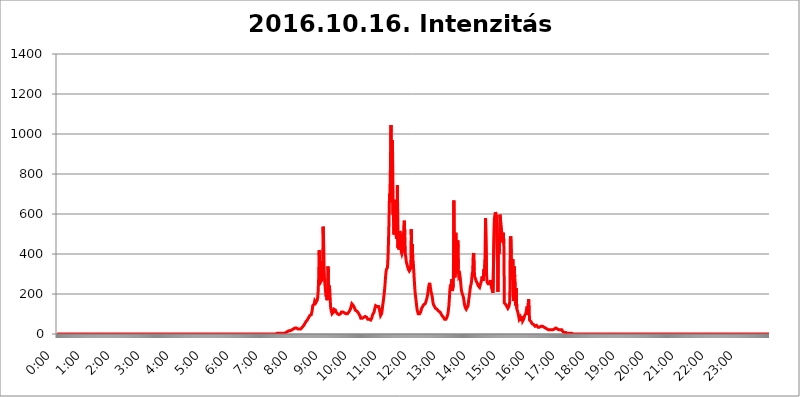
| Category | 2016.10.16. Intenzitás [W/m^2] |
|---|---|
| 0.0 | 0 |
| 0.0006944444444444445 | 0 |
| 0.001388888888888889 | 0 |
| 0.0020833333333333333 | 0 |
| 0.002777777777777778 | 0 |
| 0.003472222222222222 | 0 |
| 0.004166666666666667 | 0 |
| 0.004861111111111111 | 0 |
| 0.005555555555555556 | 0 |
| 0.0062499999999999995 | 0 |
| 0.006944444444444444 | 0 |
| 0.007638888888888889 | 0 |
| 0.008333333333333333 | 0 |
| 0.009027777777777779 | 0 |
| 0.009722222222222222 | 0 |
| 0.010416666666666666 | 0 |
| 0.011111111111111112 | 0 |
| 0.011805555555555555 | 0 |
| 0.012499999999999999 | 0 |
| 0.013194444444444444 | 0 |
| 0.013888888888888888 | 0 |
| 0.014583333333333332 | 0 |
| 0.015277777777777777 | 0 |
| 0.015972222222222224 | 0 |
| 0.016666666666666666 | 0 |
| 0.017361111111111112 | 0 |
| 0.018055555555555557 | 0 |
| 0.01875 | 0 |
| 0.019444444444444445 | 0 |
| 0.02013888888888889 | 0 |
| 0.020833333333333332 | 0 |
| 0.02152777777777778 | 0 |
| 0.022222222222222223 | 0 |
| 0.02291666666666667 | 0 |
| 0.02361111111111111 | 0 |
| 0.024305555555555556 | 0 |
| 0.024999999999999998 | 0 |
| 0.025694444444444447 | 0 |
| 0.02638888888888889 | 0 |
| 0.027083333333333334 | 0 |
| 0.027777777777777776 | 0 |
| 0.02847222222222222 | 0 |
| 0.029166666666666664 | 0 |
| 0.029861111111111113 | 0 |
| 0.030555555555555555 | 0 |
| 0.03125 | 0 |
| 0.03194444444444445 | 0 |
| 0.03263888888888889 | 0 |
| 0.03333333333333333 | 0 |
| 0.034027777777777775 | 0 |
| 0.034722222222222224 | 0 |
| 0.035416666666666666 | 0 |
| 0.036111111111111115 | 0 |
| 0.03680555555555556 | 0 |
| 0.0375 | 0 |
| 0.03819444444444444 | 0 |
| 0.03888888888888889 | 0 |
| 0.03958333333333333 | 0 |
| 0.04027777777777778 | 0 |
| 0.04097222222222222 | 0 |
| 0.041666666666666664 | 0 |
| 0.042361111111111106 | 0 |
| 0.04305555555555556 | 0 |
| 0.043750000000000004 | 0 |
| 0.044444444444444446 | 0 |
| 0.04513888888888889 | 0 |
| 0.04583333333333334 | 0 |
| 0.04652777777777778 | 0 |
| 0.04722222222222222 | 0 |
| 0.04791666666666666 | 0 |
| 0.04861111111111111 | 0 |
| 0.049305555555555554 | 0 |
| 0.049999999999999996 | 0 |
| 0.05069444444444445 | 0 |
| 0.051388888888888894 | 0 |
| 0.052083333333333336 | 0 |
| 0.05277777777777778 | 0 |
| 0.05347222222222222 | 0 |
| 0.05416666666666667 | 0 |
| 0.05486111111111111 | 0 |
| 0.05555555555555555 | 0 |
| 0.05625 | 0 |
| 0.05694444444444444 | 0 |
| 0.057638888888888885 | 0 |
| 0.05833333333333333 | 0 |
| 0.05902777777777778 | 0 |
| 0.059722222222222225 | 0 |
| 0.06041666666666667 | 0 |
| 0.061111111111111116 | 0 |
| 0.06180555555555556 | 0 |
| 0.0625 | 0 |
| 0.06319444444444444 | 0 |
| 0.06388888888888888 | 0 |
| 0.06458333333333334 | 0 |
| 0.06527777777777778 | 0 |
| 0.06597222222222222 | 0 |
| 0.06666666666666667 | 0 |
| 0.06736111111111111 | 0 |
| 0.06805555555555555 | 0 |
| 0.06874999999999999 | 0 |
| 0.06944444444444443 | 0 |
| 0.07013888888888889 | 0 |
| 0.07083333333333333 | 0 |
| 0.07152777777777779 | 0 |
| 0.07222222222222223 | 0 |
| 0.07291666666666667 | 0 |
| 0.07361111111111111 | 0 |
| 0.07430555555555556 | 0 |
| 0.075 | 0 |
| 0.07569444444444444 | 0 |
| 0.0763888888888889 | 0 |
| 0.07708333333333334 | 0 |
| 0.07777777777777778 | 0 |
| 0.07847222222222222 | 0 |
| 0.07916666666666666 | 0 |
| 0.0798611111111111 | 0 |
| 0.08055555555555556 | 0 |
| 0.08125 | 0 |
| 0.08194444444444444 | 0 |
| 0.08263888888888889 | 0 |
| 0.08333333333333333 | 0 |
| 0.08402777777777777 | 0 |
| 0.08472222222222221 | 0 |
| 0.08541666666666665 | 0 |
| 0.08611111111111112 | 0 |
| 0.08680555555555557 | 0 |
| 0.08750000000000001 | 0 |
| 0.08819444444444445 | 0 |
| 0.08888888888888889 | 0 |
| 0.08958333333333333 | 0 |
| 0.09027777777777778 | 0 |
| 0.09097222222222222 | 0 |
| 0.09166666666666667 | 0 |
| 0.09236111111111112 | 0 |
| 0.09305555555555556 | 0 |
| 0.09375 | 0 |
| 0.09444444444444444 | 0 |
| 0.09513888888888888 | 0 |
| 0.09583333333333333 | 0 |
| 0.09652777777777777 | 0 |
| 0.09722222222222222 | 0 |
| 0.09791666666666667 | 0 |
| 0.09861111111111111 | 0 |
| 0.09930555555555555 | 0 |
| 0.09999999999999999 | 0 |
| 0.10069444444444443 | 0 |
| 0.1013888888888889 | 0 |
| 0.10208333333333335 | 0 |
| 0.10277777777777779 | 0 |
| 0.10347222222222223 | 0 |
| 0.10416666666666667 | 0 |
| 0.10486111111111111 | 0 |
| 0.10555555555555556 | 0 |
| 0.10625 | 0 |
| 0.10694444444444444 | 0 |
| 0.1076388888888889 | 0 |
| 0.10833333333333334 | 0 |
| 0.10902777777777778 | 0 |
| 0.10972222222222222 | 0 |
| 0.1111111111111111 | 0 |
| 0.11180555555555556 | 0 |
| 0.11180555555555556 | 0 |
| 0.1125 | 0 |
| 0.11319444444444444 | 0 |
| 0.11388888888888889 | 0 |
| 0.11458333333333333 | 0 |
| 0.11527777777777777 | 0 |
| 0.11597222222222221 | 0 |
| 0.11666666666666665 | 0 |
| 0.1173611111111111 | 0 |
| 0.11805555555555557 | 0 |
| 0.11944444444444445 | 0 |
| 0.12013888888888889 | 0 |
| 0.12083333333333333 | 0 |
| 0.12152777777777778 | 0 |
| 0.12222222222222223 | 0 |
| 0.12291666666666667 | 0 |
| 0.12291666666666667 | 0 |
| 0.12361111111111112 | 0 |
| 0.12430555555555556 | 0 |
| 0.125 | 0 |
| 0.12569444444444444 | 0 |
| 0.12638888888888888 | 0 |
| 0.12708333333333333 | 0 |
| 0.16875 | 0 |
| 0.12847222222222224 | 0 |
| 0.12916666666666668 | 0 |
| 0.12986111111111112 | 0 |
| 0.13055555555555556 | 0 |
| 0.13125 | 0 |
| 0.13194444444444445 | 0 |
| 0.1326388888888889 | 0 |
| 0.13333333333333333 | 0 |
| 0.13402777777777777 | 0 |
| 0.13402777777777777 | 0 |
| 0.13472222222222222 | 0 |
| 0.13541666666666666 | 0 |
| 0.1361111111111111 | 0 |
| 0.13749999999999998 | 0 |
| 0.13819444444444443 | 0 |
| 0.1388888888888889 | 0 |
| 0.13958333333333334 | 0 |
| 0.14027777777777778 | 0 |
| 0.14097222222222222 | 0 |
| 0.14166666666666666 | 0 |
| 0.1423611111111111 | 0 |
| 0.14305555555555557 | 0 |
| 0.14375000000000002 | 0 |
| 0.14444444444444446 | 0 |
| 0.1451388888888889 | 0 |
| 0.1451388888888889 | 0 |
| 0.14652777777777778 | 0 |
| 0.14722222222222223 | 0 |
| 0.14791666666666667 | 0 |
| 0.1486111111111111 | 0 |
| 0.14930555555555555 | 0 |
| 0.15 | 0 |
| 0.15069444444444444 | 0 |
| 0.15138888888888888 | 0 |
| 0.15208333333333332 | 0 |
| 0.15277777777777776 | 0 |
| 0.15347222222222223 | 0 |
| 0.15416666666666667 | 0 |
| 0.15486111111111112 | 0 |
| 0.15555555555555556 | 0 |
| 0.15625 | 0 |
| 0.15694444444444444 | 0 |
| 0.15763888888888888 | 0 |
| 0.15833333333333333 | 0 |
| 0.15902777777777777 | 0 |
| 0.15972222222222224 | 0 |
| 0.16041666666666668 | 0 |
| 0.16111111111111112 | 0 |
| 0.16180555555555556 | 0 |
| 0.1625 | 0 |
| 0.16319444444444445 | 0 |
| 0.1638888888888889 | 0 |
| 0.16458333333333333 | 0 |
| 0.16527777777777777 | 0 |
| 0.16597222222222222 | 0 |
| 0.16666666666666666 | 0 |
| 0.1673611111111111 | 0 |
| 0.16805555555555554 | 0 |
| 0.16874999999999998 | 0 |
| 0.16944444444444443 | 0 |
| 0.17013888888888887 | 0 |
| 0.1708333333333333 | 0 |
| 0.17152777777777775 | 0 |
| 0.17222222222222225 | 0 |
| 0.1729166666666667 | 0 |
| 0.17361111111111113 | 0 |
| 0.17430555555555557 | 0 |
| 0.17500000000000002 | 0 |
| 0.17569444444444446 | 0 |
| 0.1763888888888889 | 0 |
| 0.17708333333333334 | 0 |
| 0.17777777777777778 | 0 |
| 0.17847222222222223 | 0 |
| 0.17916666666666667 | 0 |
| 0.1798611111111111 | 0 |
| 0.18055555555555555 | 0 |
| 0.18125 | 0 |
| 0.18194444444444444 | 0 |
| 0.1826388888888889 | 0 |
| 0.18333333333333335 | 0 |
| 0.1840277777777778 | 0 |
| 0.18472222222222223 | 0 |
| 0.18541666666666667 | 0 |
| 0.18611111111111112 | 0 |
| 0.18680555555555556 | 0 |
| 0.1875 | 0 |
| 0.18819444444444444 | 0 |
| 0.18888888888888888 | 0 |
| 0.18958333333333333 | 0 |
| 0.19027777777777777 | 0 |
| 0.1909722222222222 | 0 |
| 0.19166666666666665 | 0 |
| 0.19236111111111112 | 0 |
| 0.19305555555555554 | 0 |
| 0.19375 | 0 |
| 0.19444444444444445 | 0 |
| 0.1951388888888889 | 0 |
| 0.19583333333333333 | 0 |
| 0.19652777777777777 | 0 |
| 0.19722222222222222 | 0 |
| 0.19791666666666666 | 0 |
| 0.1986111111111111 | 0 |
| 0.19930555555555554 | 0 |
| 0.19999999999999998 | 0 |
| 0.20069444444444443 | 0 |
| 0.20138888888888887 | 0 |
| 0.2020833333333333 | 0 |
| 0.2027777777777778 | 0 |
| 0.2034722222222222 | 0 |
| 0.2041666666666667 | 0 |
| 0.20486111111111113 | 0 |
| 0.20555555555555557 | 0 |
| 0.20625000000000002 | 0 |
| 0.20694444444444446 | 0 |
| 0.2076388888888889 | 0 |
| 0.20833333333333334 | 0 |
| 0.20902777777777778 | 0 |
| 0.20972222222222223 | 0 |
| 0.21041666666666667 | 0 |
| 0.2111111111111111 | 0 |
| 0.21180555555555555 | 0 |
| 0.2125 | 0 |
| 0.21319444444444444 | 0 |
| 0.2138888888888889 | 0 |
| 0.21458333333333335 | 0 |
| 0.2152777777777778 | 0 |
| 0.21597222222222223 | 0 |
| 0.21666666666666667 | 0 |
| 0.21736111111111112 | 0 |
| 0.21805555555555556 | 0 |
| 0.21875 | 0 |
| 0.21944444444444444 | 0 |
| 0.22013888888888888 | 0 |
| 0.22083333333333333 | 0 |
| 0.22152777777777777 | 0 |
| 0.2222222222222222 | 0 |
| 0.22291666666666665 | 0 |
| 0.2236111111111111 | 0 |
| 0.22430555555555556 | 0 |
| 0.225 | 0 |
| 0.22569444444444445 | 0 |
| 0.2263888888888889 | 0 |
| 0.22708333333333333 | 0 |
| 0.22777777777777777 | 0 |
| 0.22847222222222222 | 0 |
| 0.22916666666666666 | 0 |
| 0.2298611111111111 | 0 |
| 0.23055555555555554 | 0 |
| 0.23124999999999998 | 0 |
| 0.23194444444444443 | 0 |
| 0.23263888888888887 | 0 |
| 0.2333333333333333 | 0 |
| 0.2340277777777778 | 0 |
| 0.2347222222222222 | 0 |
| 0.2354166666666667 | 0 |
| 0.23611111111111113 | 0 |
| 0.23680555555555557 | 0 |
| 0.23750000000000002 | 0 |
| 0.23819444444444446 | 0 |
| 0.2388888888888889 | 0 |
| 0.23958333333333334 | 0 |
| 0.24027777777777778 | 0 |
| 0.24097222222222223 | 0 |
| 0.24166666666666667 | 0 |
| 0.2423611111111111 | 0 |
| 0.24305555555555555 | 0 |
| 0.24375 | 0 |
| 0.24444444444444446 | 0 |
| 0.24513888888888888 | 0 |
| 0.24583333333333335 | 0 |
| 0.2465277777777778 | 0 |
| 0.24722222222222223 | 0 |
| 0.24791666666666667 | 0 |
| 0.24861111111111112 | 0 |
| 0.24930555555555556 | 0 |
| 0.25 | 0 |
| 0.25069444444444444 | 0 |
| 0.2513888888888889 | 0 |
| 0.2520833333333333 | 0 |
| 0.25277777777777777 | 0 |
| 0.2534722222222222 | 0 |
| 0.25416666666666665 | 0 |
| 0.2548611111111111 | 0 |
| 0.2555555555555556 | 0 |
| 0.25625000000000003 | 0 |
| 0.2569444444444445 | 0 |
| 0.2576388888888889 | 0 |
| 0.25833333333333336 | 0 |
| 0.2590277777777778 | 0 |
| 0.25972222222222224 | 0 |
| 0.2604166666666667 | 0 |
| 0.2611111111111111 | 0 |
| 0.26180555555555557 | 0 |
| 0.2625 | 0 |
| 0.26319444444444445 | 0 |
| 0.2638888888888889 | 0 |
| 0.26458333333333334 | 0 |
| 0.2652777777777778 | 0 |
| 0.2659722222222222 | 0 |
| 0.26666666666666666 | 0 |
| 0.2673611111111111 | 0 |
| 0.26805555555555555 | 0 |
| 0.26875 | 0 |
| 0.26944444444444443 | 0 |
| 0.2701388888888889 | 0 |
| 0.2708333333333333 | 0 |
| 0.27152777777777776 | 0 |
| 0.2722222222222222 | 0 |
| 0.27291666666666664 | 0 |
| 0.2736111111111111 | 0 |
| 0.2743055555555555 | 0 |
| 0.27499999999999997 | 0 |
| 0.27569444444444446 | 0 |
| 0.27638888888888885 | 0 |
| 0.27708333333333335 | 0 |
| 0.2777777777777778 | 0 |
| 0.27847222222222223 | 0 |
| 0.2791666666666667 | 0 |
| 0.2798611111111111 | 0 |
| 0.28055555555555556 | 0 |
| 0.28125 | 0 |
| 0.28194444444444444 | 0 |
| 0.2826388888888889 | 0 |
| 0.2833333333333333 | 0 |
| 0.28402777777777777 | 0 |
| 0.2847222222222222 | 0 |
| 0.28541666666666665 | 0 |
| 0.28611111111111115 | 0 |
| 0.28680555555555554 | 0 |
| 0.28750000000000003 | 0 |
| 0.2881944444444445 | 0 |
| 0.2888888888888889 | 0 |
| 0.28958333333333336 | 0 |
| 0.2902777777777778 | 0 |
| 0.29097222222222224 | 0 |
| 0.2916666666666667 | 0 |
| 0.2923611111111111 | 0 |
| 0.29305555555555557 | 0 |
| 0.29375 | 0 |
| 0.29444444444444445 | 0 |
| 0.2951388888888889 | 0 |
| 0.29583333333333334 | 0 |
| 0.2965277777777778 | 0 |
| 0.2972222222222222 | 0 |
| 0.29791666666666666 | 0 |
| 0.2986111111111111 | 0 |
| 0.29930555555555555 | 0 |
| 0.3 | 0 |
| 0.30069444444444443 | 0 |
| 0.3013888888888889 | 0 |
| 0.3020833333333333 | 0 |
| 0.30277777777777776 | 0 |
| 0.3034722222222222 | 0 |
| 0.30416666666666664 | 0 |
| 0.3048611111111111 | 0 |
| 0.3055555555555555 | 0 |
| 0.30624999999999997 | 0 |
| 0.3069444444444444 | 3.525 |
| 0.3076388888888889 | 3.525 |
| 0.30833333333333335 | 3.525 |
| 0.3090277777777778 | 3.525 |
| 0.30972222222222223 | 3.525 |
| 0.3104166666666667 | 3.525 |
| 0.3111111111111111 | 3.525 |
| 0.31180555555555556 | 3.525 |
| 0.3125 | 3.525 |
| 0.31319444444444444 | 3.525 |
| 0.3138888888888889 | 3.525 |
| 0.3145833333333333 | 3.525 |
| 0.31527777777777777 | 3.525 |
| 0.3159722222222222 | 3.525 |
| 0.31666666666666665 | 3.525 |
| 0.31736111111111115 | 3.525 |
| 0.31805555555555554 | 3.525 |
| 0.31875000000000003 | 3.525 |
| 0.3194444444444445 | 3.525 |
| 0.3201388888888889 | 7.887 |
| 0.32083333333333336 | 7.887 |
| 0.3215277777777778 | 7.887 |
| 0.32222222222222224 | 7.887 |
| 0.3229166666666667 | 12.257 |
| 0.3236111111111111 | 12.257 |
| 0.32430555555555557 | 16.636 |
| 0.325 | 16.636 |
| 0.32569444444444445 | 16.636 |
| 0.3263888888888889 | 16.636 |
| 0.32708333333333334 | 16.636 |
| 0.3277777777777778 | 21.024 |
| 0.3284722222222222 | 21.024 |
| 0.32916666666666666 | 21.024 |
| 0.3298611111111111 | 21.024 |
| 0.33055555555555555 | 21.024 |
| 0.33125 | 25.419 |
| 0.33194444444444443 | 25.419 |
| 0.3326388888888889 | 25.419 |
| 0.3333333333333333 | 29.823 |
| 0.3340277777777778 | 29.823 |
| 0.3347222222222222 | 29.823 |
| 0.3354166666666667 | 29.823 |
| 0.3361111111111111 | 29.823 |
| 0.3368055555555556 | 29.823 |
| 0.33749999999999997 | 25.419 |
| 0.33819444444444446 | 25.419 |
| 0.33888888888888885 | 25.419 |
| 0.33958333333333335 | 25.419 |
| 0.34027777777777773 | 25.419 |
| 0.34097222222222223 | 25.419 |
| 0.3416666666666666 | 25.419 |
| 0.3423611111111111 | 25.419 |
| 0.3430555555555555 | 29.823 |
| 0.34375 | 34.234 |
| 0.3444444444444445 | 34.234 |
| 0.3451388888888889 | 38.653 |
| 0.3458333333333334 | 43.079 |
| 0.34652777777777777 | 47.511 |
| 0.34722222222222227 | 51.951 |
| 0.34791666666666665 | 56.398 |
| 0.34861111111111115 | 60.85 |
| 0.34930555555555554 | 65.31 |
| 0.35000000000000003 | 65.31 |
| 0.3506944444444444 | 69.775 |
| 0.3513888888888889 | 74.246 |
| 0.3520833333333333 | 78.722 |
| 0.3527777777777778 | 83.205 |
| 0.3534722222222222 | 83.205 |
| 0.3541666666666667 | 92.184 |
| 0.3548611111111111 | 92.184 |
| 0.35555555555555557 | 92.184 |
| 0.35625 | 96.682 |
| 0.35694444444444445 | 101.184 |
| 0.3576388888888889 | 119.235 |
| 0.35833333333333334 | 141.884 |
| 0.3590277777777778 | 146.423 |
| 0.3597222222222222 | 146.423 |
| 0.36041666666666666 | 150.964 |
| 0.3611111111111111 | 164.605 |
| 0.36180555555555555 | 164.605 |
| 0.3625 | 155.509 |
| 0.36319444444444443 | 150.964 |
| 0.3638888888888889 | 155.509 |
| 0.3645833333333333 | 169.156 |
| 0.3652777777777778 | 182.82 |
| 0.3659722222222222 | 214.746 |
| 0.3666666666666667 | 278.603 |
| 0.3673611111111111 | 418.492 |
| 0.3680555555555556 | 360.221 |
| 0.36874999999999997 | 351.198 |
| 0.36944444444444446 | 287.709 |
| 0.37013888888888885 | 264.932 |
| 0.37083333333333335 | 264.932 |
| 0.37152777777777773 | 274.047 |
| 0.37222222222222223 | 324.052 |
| 0.3729166666666666 | 536.82 |
| 0.3736111111111111 | 467.187 |
| 0.3743055555555555 | 319.517 |
| 0.375 | 264.932 |
| 0.3756944444444445 | 237.564 |
| 0.3763888888888889 | 210.182 |
| 0.3770833333333334 | 187.378 |
| 0.37777777777777777 | 196.497 |
| 0.37847222222222227 | 169.156 |
| 0.37916666666666665 | 191.937 |
| 0.37986111111111115 | 337.639 |
| 0.38055555555555554 | 205.62 |
| 0.38125000000000003 | 242.127 |
| 0.3819444444444444 | 233 |
| 0.3826388888888889 | 187.378 |
| 0.3833333333333333 | 137.347 |
| 0.3840277777777778 | 119.235 |
| 0.3847222222222222 | 110.201 |
| 0.3854166666666667 | 101.184 |
| 0.3861111111111111 | 105.69 |
| 0.38680555555555557 | 105.69 |
| 0.3875 | 110.201 |
| 0.38819444444444445 | 123.758 |
| 0.3888888888888889 | 123.758 |
| 0.38958333333333334 | 119.235 |
| 0.3902777777777778 | 119.235 |
| 0.3909722222222222 | 110.201 |
| 0.39166666666666666 | 110.201 |
| 0.3923611111111111 | 105.69 |
| 0.39305555555555555 | 101.184 |
| 0.39375 | 96.682 |
| 0.39444444444444443 | 96.682 |
| 0.3951388888888889 | 96.682 |
| 0.3958333333333333 | 96.682 |
| 0.3965277777777778 | 96.682 |
| 0.3972222222222222 | 101.184 |
| 0.3979166666666667 | 101.184 |
| 0.3986111111111111 | 110.201 |
| 0.3993055555555556 | 114.716 |
| 0.39999999999999997 | 114.716 |
| 0.40069444444444446 | 110.201 |
| 0.40138888888888885 | 110.201 |
| 0.40208333333333335 | 105.69 |
| 0.40277777777777773 | 105.69 |
| 0.40347222222222223 | 101.184 |
| 0.4041666666666666 | 101.184 |
| 0.4048611111111111 | 101.184 |
| 0.4055555555555555 | 101.184 |
| 0.40625 | 101.184 |
| 0.4069444444444445 | 101.184 |
| 0.4076388888888889 | 101.184 |
| 0.4083333333333334 | 105.69 |
| 0.40902777777777777 | 110.201 |
| 0.40972222222222227 | 110.201 |
| 0.41041666666666665 | 114.716 |
| 0.41111111111111115 | 123.758 |
| 0.41180555555555554 | 132.814 |
| 0.41250000000000003 | 141.884 |
| 0.4131944444444444 | 150.964 |
| 0.4138888888888889 | 150.964 |
| 0.4145833333333333 | 146.423 |
| 0.4152777777777778 | 141.884 |
| 0.4159722222222222 | 137.347 |
| 0.4166666666666667 | 132.814 |
| 0.4173611111111111 | 128.284 |
| 0.41805555555555557 | 119.235 |
| 0.41875 | 114.716 |
| 0.41944444444444445 | 114.716 |
| 0.4201388888888889 | 114.716 |
| 0.42083333333333334 | 110.201 |
| 0.4215277777777778 | 110.201 |
| 0.4222222222222222 | 105.69 |
| 0.42291666666666666 | 101.184 |
| 0.4236111111111111 | 96.682 |
| 0.42430555555555555 | 92.184 |
| 0.425 | 87.692 |
| 0.42569444444444443 | 78.722 |
| 0.4263888888888889 | 74.246 |
| 0.4270833333333333 | 74.246 |
| 0.4277777777777778 | 78.722 |
| 0.4284722222222222 | 83.205 |
| 0.4291666666666667 | 83.205 |
| 0.4298611111111111 | 83.205 |
| 0.4305555555555556 | 87.692 |
| 0.43124999999999997 | 87.692 |
| 0.43194444444444446 | 87.692 |
| 0.43263888888888885 | 87.692 |
| 0.43333333333333335 | 83.205 |
| 0.43402777777777773 | 83.205 |
| 0.43472222222222223 | 78.722 |
| 0.4354166666666666 | 74.246 |
| 0.4361111111111111 | 74.246 |
| 0.4368055555555555 | 69.775 |
| 0.4375 | 74.246 |
| 0.4381944444444445 | 74.246 |
| 0.4388888888888889 | 78.722 |
| 0.4395833333333334 | 69.775 |
| 0.44027777777777777 | 69.775 |
| 0.44097222222222227 | 78.722 |
| 0.44166666666666665 | 87.692 |
| 0.44236111111111115 | 96.682 |
| 0.44305555555555554 | 96.682 |
| 0.44375000000000003 | 101.184 |
| 0.4444444444444444 | 110.201 |
| 0.4451388888888889 | 123.758 |
| 0.4458333333333333 | 132.814 |
| 0.4465277777777778 | 141.884 |
| 0.4472222222222222 | 146.423 |
| 0.4479166666666667 | 141.884 |
| 0.4486111111111111 | 137.347 |
| 0.44930555555555557 | 137.347 |
| 0.45 | 137.347 |
| 0.45069444444444445 | 137.347 |
| 0.4513888888888889 | 128.284 |
| 0.45208333333333334 | 119.235 |
| 0.4527777777777778 | 105.69 |
| 0.4534722222222222 | 92.184 |
| 0.45416666666666666 | 92.184 |
| 0.4548611111111111 | 101.184 |
| 0.45555555555555555 | 114.716 |
| 0.45625 | 137.347 |
| 0.45694444444444443 | 155.509 |
| 0.4576388888888889 | 173.709 |
| 0.4583333333333333 | 196.497 |
| 0.4590277777777778 | 219.309 |
| 0.4597222222222222 | 246.689 |
| 0.4604166666666667 | 283.156 |
| 0.4611111111111111 | 310.44 |
| 0.4618055555555556 | 324.052 |
| 0.46249999999999997 | 324.052 |
| 0.46319444444444446 | 333.113 |
| 0.46388888888888885 | 382.715 |
| 0.46458333333333335 | 462.786 |
| 0.46527777777777773 | 558.261 |
| 0.46597222222222223 | 695.666 |
| 0.4666666666666666 | 707.8 |
| 0.4673611111111111 | 845.365 |
| 0.4680555555555555 | 1044.762 |
| 0.46875 | 658.909 |
| 0.4694444444444445 | 829.981 |
| 0.4701388888888889 | 970.034 |
| 0.4708333333333334 | 600.661 |
| 0.47152777777777777 | 588.009 |
| 0.47222222222222227 | 497.836 |
| 0.47291666666666665 | 609.062 |
| 0.47361111111111115 | 671.22 |
| 0.47430555555555554 | 532.513 |
| 0.47500000000000003 | 604.864 |
| 0.4756944444444444 | 475.972 |
| 0.4763888888888889 | 493.475 |
| 0.4770833333333333 | 743.859 |
| 0.4777777777777778 | 431.833 |
| 0.4784722222222222 | 449.551 |
| 0.4791666666666667 | 422.943 |
| 0.4798611111111111 | 480.356 |
| 0.48055555555555557 | 515.223 |
| 0.48125 | 493.475 |
| 0.48194444444444445 | 462.786 |
| 0.4826388888888889 | 409.574 |
| 0.48333333333333334 | 400.638 |
| 0.4840277777777778 | 409.574 |
| 0.4847222222222222 | 431.833 |
| 0.48541666666666666 | 467.187 |
| 0.4861111111111111 | 541.121 |
| 0.48680555555555555 | 566.793 |
| 0.4875 | 493.475 |
| 0.48819444444444443 | 400.638 |
| 0.4888888888888889 | 382.715 |
| 0.4895833333333333 | 360.221 |
| 0.4902777777777778 | 351.198 |
| 0.4909722222222222 | 342.162 |
| 0.4916666666666667 | 333.113 |
| 0.4923611111111111 | 324.052 |
| 0.4930555555555556 | 319.517 |
| 0.49374999999999997 | 314.98 |
| 0.49444444444444446 | 314.98 |
| 0.49513888888888885 | 314.98 |
| 0.49583333333333335 | 328.584 |
| 0.49652777777777773 | 523.88 |
| 0.49722222222222223 | 396.164 |
| 0.4979166666666666 | 449.551 |
| 0.4986111111111111 | 378.224 |
| 0.4993055555555555 | 360.221 |
| 0.5 | 314.98 |
| 0.5006944444444444 | 274.047 |
| 0.5013888888888889 | 233 |
| 0.5020833333333333 | 201.058 |
| 0.5027777777777778 | 182.82 |
| 0.5034722222222222 | 160.056 |
| 0.5041666666666667 | 137.347 |
| 0.5048611111111111 | 119.235 |
| 0.5055555555555555 | 110.201 |
| 0.50625 | 101.184 |
| 0.5069444444444444 | 96.682 |
| 0.5076388888888889 | 101.184 |
| 0.5083333333333333 | 101.184 |
| 0.5090277777777777 | 105.69 |
| 0.5097222222222222 | 110.201 |
| 0.5104166666666666 | 119.235 |
| 0.5111111111111112 | 128.284 |
| 0.5118055555555555 | 132.814 |
| 0.5125000000000001 | 137.347 |
| 0.5131944444444444 | 141.884 |
| 0.513888888888889 | 146.423 |
| 0.5145833333333333 | 146.423 |
| 0.5152777777777778 | 150.964 |
| 0.5159722222222222 | 150.964 |
| 0.5166666666666667 | 155.509 |
| 0.517361111111111 | 164.605 |
| 0.5180555555555556 | 169.156 |
| 0.5187499999999999 | 182.82 |
| 0.5194444444444445 | 196.497 |
| 0.5201388888888888 | 214.746 |
| 0.5208333333333334 | 233 |
| 0.5215277777777778 | 246.689 |
| 0.5222222222222223 | 255.813 |
| 0.5229166666666667 | 237.564 |
| 0.5236111111111111 | 228.436 |
| 0.5243055555555556 | 210.182 |
| 0.525 | 201.058 |
| 0.5256944444444445 | 191.937 |
| 0.5263888888888889 | 173.709 |
| 0.5270833333333333 | 155.509 |
| 0.5277777777777778 | 146.423 |
| 0.5284722222222222 | 141.884 |
| 0.5291666666666667 | 137.347 |
| 0.5298611111111111 | 132.814 |
| 0.5305555555555556 | 128.284 |
| 0.53125 | 128.284 |
| 0.5319444444444444 | 123.758 |
| 0.5326388888888889 | 123.758 |
| 0.5333333333333333 | 119.235 |
| 0.5340277777777778 | 119.235 |
| 0.5347222222222222 | 114.716 |
| 0.5354166666666667 | 114.716 |
| 0.5361111111111111 | 110.201 |
| 0.5368055555555555 | 110.201 |
| 0.5375 | 105.69 |
| 0.5381944444444444 | 101.184 |
| 0.5388888888888889 | 96.682 |
| 0.5395833333333333 | 92.184 |
| 0.5402777777777777 | 92.184 |
| 0.5409722222222222 | 87.692 |
| 0.5416666666666666 | 83.205 |
| 0.5423611111111112 | 78.722 |
| 0.5430555555555555 | 74.246 |
| 0.5437500000000001 | 74.246 |
| 0.5444444444444444 | 74.246 |
| 0.545138888888889 | 74.246 |
| 0.5458333333333333 | 74.246 |
| 0.5465277777777778 | 83.205 |
| 0.5472222222222222 | 92.184 |
| 0.5479166666666667 | 101.184 |
| 0.548611111111111 | 119.235 |
| 0.5493055555555556 | 141.884 |
| 0.5499999999999999 | 178.264 |
| 0.5506944444444445 | 219.309 |
| 0.5513888888888888 | 242.127 |
| 0.5520833333333334 | 237.564 |
| 0.5527777777777778 | 251.251 |
| 0.5534722222222223 | 274.047 |
| 0.5541666666666667 | 214.746 |
| 0.5548611111111111 | 219.309 |
| 0.5555555555555556 | 246.689 |
| 0.55625 | 667.123 |
| 0.5569444444444445 | 324.052 |
| 0.5576388888888889 | 283.156 |
| 0.5583333333333333 | 296.808 |
| 0.5590277777777778 | 506.542 |
| 0.5597222222222222 | 324.052 |
| 0.5604166666666667 | 301.354 |
| 0.5611111111111111 | 301.354 |
| 0.5618055555555556 | 467.187 |
| 0.5625 | 324.052 |
| 0.5631944444444444 | 287.709 |
| 0.5638888888888889 | 292.259 |
| 0.5645833333333333 | 296.808 |
| 0.5652777777777778 | 278.603 |
| 0.5659722222222222 | 251.251 |
| 0.5666666666666667 | 223.873 |
| 0.5673611111111111 | 210.182 |
| 0.5680555555555555 | 201.058 |
| 0.56875 | 196.497 |
| 0.5694444444444444 | 187.378 |
| 0.5701388888888889 | 173.709 |
| 0.5708333333333333 | 155.509 |
| 0.5715277777777777 | 141.884 |
| 0.5722222222222222 | 132.814 |
| 0.5729166666666666 | 128.284 |
| 0.5736111111111112 | 123.758 |
| 0.5743055555555555 | 123.758 |
| 0.5750000000000001 | 128.284 |
| 0.5756944444444444 | 137.347 |
| 0.576388888888889 | 146.423 |
| 0.5770833333333333 | 169.156 |
| 0.5777777777777778 | 187.378 |
| 0.5784722222222222 | 205.62 |
| 0.5791666666666667 | 228.436 |
| 0.579861111111111 | 242.127 |
| 0.5805555555555556 | 251.251 |
| 0.5812499999999999 | 269.49 |
| 0.5819444444444445 | 301.354 |
| 0.5826388888888888 | 310.44 |
| 0.5833333333333334 | 387.202 |
| 0.5840277777777778 | 405.108 |
| 0.5847222222222223 | 324.052 |
| 0.5854166666666667 | 287.709 |
| 0.5861111111111111 | 287.709 |
| 0.5868055555555556 | 274.047 |
| 0.5875 | 264.932 |
| 0.5881944444444445 | 260.373 |
| 0.5888888888888889 | 255.813 |
| 0.5895833333333333 | 251.251 |
| 0.5902777777777778 | 242.127 |
| 0.5909722222222222 | 237.564 |
| 0.5916666666666667 | 237.564 |
| 0.5923611111111111 | 233 |
| 0.5930555555555556 | 237.564 |
| 0.59375 | 251.251 |
| 0.5944444444444444 | 246.689 |
| 0.5951388888888889 | 269.49 |
| 0.5958333333333333 | 287.709 |
| 0.5965277777777778 | 287.709 |
| 0.5972222222222222 | 264.932 |
| 0.5979166666666667 | 264.932 |
| 0.5986111111111111 | 324.052 |
| 0.5993055555555555 | 292.259 |
| 0.6 | 373.729 |
| 0.6006944444444444 | 579.542 |
| 0.6013888888888889 | 575.299 |
| 0.6020833333333333 | 305.898 |
| 0.6027777777777777 | 260.373 |
| 0.6034722222222222 | 255.813 |
| 0.6041666666666666 | 251.251 |
| 0.6048611111111112 | 246.689 |
| 0.6055555555555555 | 246.689 |
| 0.6062500000000001 | 251.251 |
| 0.6069444444444444 | 255.813 |
| 0.607638888888889 | 269.49 |
| 0.6083333333333333 | 255.813 |
| 0.6090277777777778 | 233 |
| 0.6097222222222222 | 223.873 |
| 0.6104166666666667 | 214.746 |
| 0.611111111111111 | 205.62 |
| 0.6118055555555556 | 210.182 |
| 0.6124999999999999 | 210.182 |
| 0.6131944444444445 | 579.542 |
| 0.6138888888888888 | 596.45 |
| 0.6145833333333334 | 609.062 |
| 0.6152777777777778 | 600.661 |
| 0.6159722222222223 | 592.233 |
| 0.6166666666666667 | 510.885 |
| 0.6173611111111111 | 427.39 |
| 0.6180555555555556 | 210.182 |
| 0.61875 | 480.356 |
| 0.6194444444444445 | 400.638 |
| 0.6201388888888889 | 422.943 |
| 0.6208333333333333 | 596.45 |
| 0.6215277777777778 | 579.542 |
| 0.6222222222222222 | 553.986 |
| 0.6229166666666667 | 528.2 |
| 0.6236111111111111 | 532.513 |
| 0.6243055555555556 | 467.187 |
| 0.625 | 458.38 |
| 0.6256944444444444 | 506.542 |
| 0.6263888888888889 | 449.551 |
| 0.6270833333333333 | 155.509 |
| 0.6277777777777778 | 150.964 |
| 0.6284722222222222 | 150.964 |
| 0.6291666666666667 | 146.423 |
| 0.6298611111111111 | 146.423 |
| 0.6305555555555555 | 137.347 |
| 0.63125 | 132.814 |
| 0.6319444444444444 | 128.284 |
| 0.6326388888888889 | 132.814 |
| 0.6333333333333333 | 137.347 |
| 0.6340277777777777 | 146.423 |
| 0.6347222222222222 | 164.605 |
| 0.6354166666666666 | 475.972 |
| 0.6361111111111112 | 489.108 |
| 0.6368055555555555 | 396.164 |
| 0.6375000000000001 | 337.639 |
| 0.6381944444444444 | 269.49 |
| 0.638888888888889 | 373.729 |
| 0.6395833333333333 | 187.378 |
| 0.6402777777777778 | 164.605 |
| 0.6409722222222222 | 337.639 |
| 0.6416666666666667 | 283.156 |
| 0.642361111111111 | 251.251 |
| 0.6430555555555556 | 141.884 |
| 0.6437499999999999 | 228.436 |
| 0.6444444444444445 | 128.284 |
| 0.6451388888888888 | 119.235 |
| 0.6458333333333334 | 110.201 |
| 0.6465277777777778 | 101.184 |
| 0.6472222222222223 | 87.692 |
| 0.6479166666666667 | 74.246 |
| 0.6486111111111111 | 74.246 |
| 0.6493055555555556 | 83.205 |
| 0.65 | 69.775 |
| 0.6506944444444445 | 78.722 |
| 0.6513888888888889 | 65.31 |
| 0.6520833333333333 | 87.692 |
| 0.6527777777777778 | 65.31 |
| 0.6534722222222222 | 69.775 |
| 0.6541666666666667 | 74.246 |
| 0.6548611111111111 | 83.205 |
| 0.6555555555555556 | 92.184 |
| 0.65625 | 92.184 |
| 0.6569444444444444 | 101.184 |
| 0.6576388888888889 | 110.201 |
| 0.6583333333333333 | 105.69 |
| 0.6590277777777778 | 137.347 |
| 0.6597222222222222 | 96.682 |
| 0.6604166666666667 | 92.184 |
| 0.6611111111111111 | 173.709 |
| 0.6618055555555555 | 114.716 |
| 0.6625 | 69.775 |
| 0.6631944444444444 | 65.31 |
| 0.6638888888888889 | 65.31 |
| 0.6645833333333333 | 60.85 |
| 0.6652777777777777 | 56.398 |
| 0.6659722222222222 | 51.951 |
| 0.6666666666666666 | 47.511 |
| 0.6673611111111111 | 47.511 |
| 0.6680555555555556 | 47.511 |
| 0.6687500000000001 | 47.511 |
| 0.6694444444444444 | 43.079 |
| 0.6701388888888888 | 38.653 |
| 0.6708333333333334 | 38.653 |
| 0.6715277777777778 | 38.653 |
| 0.6722222222222222 | 43.079 |
| 0.6729166666666666 | 43.079 |
| 0.6736111111111112 | 38.653 |
| 0.6743055555555556 | 34.234 |
| 0.6749999999999999 | 34.234 |
| 0.6756944444444444 | 34.234 |
| 0.6763888888888889 | 34.234 |
| 0.6770833333333334 | 34.234 |
| 0.6777777777777777 | 38.653 |
| 0.6784722222222223 | 38.653 |
| 0.6791666666666667 | 38.653 |
| 0.6798611111111111 | 38.653 |
| 0.6805555555555555 | 38.653 |
| 0.68125 | 38.653 |
| 0.6819444444444445 | 38.653 |
| 0.6826388888888889 | 34.234 |
| 0.6833333333333332 | 29.823 |
| 0.6840277777777778 | 29.823 |
| 0.6847222222222222 | 29.823 |
| 0.6854166666666667 | 25.419 |
| 0.686111111111111 | 25.419 |
| 0.6868055555555556 | 25.419 |
| 0.6875 | 21.024 |
| 0.6881944444444444 | 21.024 |
| 0.688888888888889 | 21.024 |
| 0.6895833333333333 | 21.024 |
| 0.6902777777777778 | 21.024 |
| 0.6909722222222222 | 21.024 |
| 0.6916666666666668 | 21.024 |
| 0.6923611111111111 | 21.024 |
| 0.6930555555555555 | 21.024 |
| 0.69375 | 21.024 |
| 0.6944444444444445 | 21.024 |
| 0.6951388888888889 | 21.024 |
| 0.6958333333333333 | 21.024 |
| 0.6965277777777777 | 25.419 |
| 0.6972222222222223 | 25.419 |
| 0.6979166666666666 | 25.419 |
| 0.6986111111111111 | 25.419 |
| 0.6993055555555556 | 29.823 |
| 0.7000000000000001 | 29.823 |
| 0.7006944444444444 | 25.419 |
| 0.7013888888888888 | 25.419 |
| 0.7020833333333334 | 25.419 |
| 0.7027777777777778 | 25.419 |
| 0.7034722222222222 | 21.024 |
| 0.7041666666666666 | 21.024 |
| 0.7048611111111112 | 21.024 |
| 0.7055555555555556 | 21.024 |
| 0.7062499999999999 | 21.024 |
| 0.7069444444444444 | 16.636 |
| 0.7076388888888889 | 21.024 |
| 0.7083333333333334 | 16.636 |
| 0.7090277777777777 | 12.257 |
| 0.7097222222222223 | 12.257 |
| 0.7104166666666667 | 12.257 |
| 0.7111111111111111 | 7.887 |
| 0.7118055555555555 | 7.887 |
| 0.7125 | 7.887 |
| 0.7131944444444445 | 7.887 |
| 0.7138888888888889 | 7.887 |
| 0.7145833333333332 | 7.887 |
| 0.7152777777777778 | 3.525 |
| 0.7159722222222222 | 3.525 |
| 0.7166666666666667 | 3.525 |
| 0.717361111111111 | 3.525 |
| 0.7180555555555556 | 3.525 |
| 0.71875 | 3.525 |
| 0.7194444444444444 | 3.525 |
| 0.720138888888889 | 3.525 |
| 0.7208333333333333 | 3.525 |
| 0.7215277777777778 | 3.525 |
| 0.7222222222222222 | 0 |
| 0.7229166666666668 | 0 |
| 0.7236111111111111 | 0 |
| 0.7243055555555555 | 0 |
| 0.725 | 0 |
| 0.7256944444444445 | 0 |
| 0.7263888888888889 | 0 |
| 0.7270833333333333 | 0 |
| 0.7277777777777777 | 0 |
| 0.7284722222222223 | 0 |
| 0.7291666666666666 | 0 |
| 0.7298611111111111 | 0 |
| 0.7305555555555556 | 0 |
| 0.7312500000000001 | 0 |
| 0.7319444444444444 | 0 |
| 0.7326388888888888 | 0 |
| 0.7333333333333334 | 0 |
| 0.7340277777777778 | 0 |
| 0.7347222222222222 | 0 |
| 0.7354166666666666 | 0 |
| 0.7361111111111112 | 0 |
| 0.7368055555555556 | 0 |
| 0.7374999999999999 | 0 |
| 0.7381944444444444 | 0 |
| 0.7388888888888889 | 0 |
| 0.7395833333333334 | 0 |
| 0.7402777777777777 | 0 |
| 0.7409722222222223 | 0 |
| 0.7416666666666667 | 0 |
| 0.7423611111111111 | 0 |
| 0.7430555555555555 | 0 |
| 0.74375 | 0 |
| 0.7444444444444445 | 0 |
| 0.7451388888888889 | 0 |
| 0.7458333333333332 | 0 |
| 0.7465277777777778 | 0 |
| 0.7472222222222222 | 0 |
| 0.7479166666666667 | 0 |
| 0.748611111111111 | 0 |
| 0.7493055555555556 | 0 |
| 0.75 | 0 |
| 0.7506944444444444 | 0 |
| 0.751388888888889 | 0 |
| 0.7520833333333333 | 0 |
| 0.7527777777777778 | 0 |
| 0.7534722222222222 | 0 |
| 0.7541666666666668 | 0 |
| 0.7548611111111111 | 0 |
| 0.7555555555555555 | 0 |
| 0.75625 | 0 |
| 0.7569444444444445 | 0 |
| 0.7576388888888889 | 0 |
| 0.7583333333333333 | 0 |
| 0.7590277777777777 | 0 |
| 0.7597222222222223 | 0 |
| 0.7604166666666666 | 0 |
| 0.7611111111111111 | 0 |
| 0.7618055555555556 | 0 |
| 0.7625000000000001 | 0 |
| 0.7631944444444444 | 0 |
| 0.7638888888888888 | 0 |
| 0.7645833333333334 | 0 |
| 0.7652777777777778 | 0 |
| 0.7659722222222222 | 0 |
| 0.7666666666666666 | 0 |
| 0.7673611111111112 | 0 |
| 0.7680555555555556 | 0 |
| 0.7687499999999999 | 0 |
| 0.7694444444444444 | 0 |
| 0.7701388888888889 | 0 |
| 0.7708333333333334 | 0 |
| 0.7715277777777777 | 0 |
| 0.7722222222222223 | 0 |
| 0.7729166666666667 | 0 |
| 0.7736111111111111 | 0 |
| 0.7743055555555555 | 0 |
| 0.775 | 0 |
| 0.7756944444444445 | 0 |
| 0.7763888888888889 | 0 |
| 0.7770833333333332 | 0 |
| 0.7777777777777778 | 0 |
| 0.7784722222222222 | 0 |
| 0.7791666666666667 | 0 |
| 0.779861111111111 | 0 |
| 0.7805555555555556 | 0 |
| 0.78125 | 0 |
| 0.7819444444444444 | 0 |
| 0.782638888888889 | 0 |
| 0.7833333333333333 | 0 |
| 0.7840277777777778 | 0 |
| 0.7847222222222222 | 0 |
| 0.7854166666666668 | 0 |
| 0.7861111111111111 | 0 |
| 0.7868055555555555 | 0 |
| 0.7875 | 0 |
| 0.7881944444444445 | 0 |
| 0.7888888888888889 | 0 |
| 0.7895833333333333 | 0 |
| 0.7902777777777777 | 0 |
| 0.7909722222222223 | 0 |
| 0.7916666666666666 | 0 |
| 0.7923611111111111 | 0 |
| 0.7930555555555556 | 0 |
| 0.7937500000000001 | 0 |
| 0.7944444444444444 | 0 |
| 0.7951388888888888 | 0 |
| 0.7958333333333334 | 0 |
| 0.7965277777777778 | 0 |
| 0.7972222222222222 | 0 |
| 0.7979166666666666 | 0 |
| 0.7986111111111112 | 0 |
| 0.7993055555555556 | 0 |
| 0.7999999999999999 | 0 |
| 0.8006944444444444 | 0 |
| 0.8013888888888889 | 0 |
| 0.8020833333333334 | 0 |
| 0.8027777777777777 | 0 |
| 0.8034722222222223 | 0 |
| 0.8041666666666667 | 0 |
| 0.8048611111111111 | 0 |
| 0.8055555555555555 | 0 |
| 0.80625 | 0 |
| 0.8069444444444445 | 0 |
| 0.8076388888888889 | 0 |
| 0.8083333333333332 | 0 |
| 0.8090277777777778 | 0 |
| 0.8097222222222222 | 0 |
| 0.8104166666666667 | 0 |
| 0.811111111111111 | 0 |
| 0.8118055555555556 | 0 |
| 0.8125 | 0 |
| 0.8131944444444444 | 0 |
| 0.813888888888889 | 0 |
| 0.8145833333333333 | 0 |
| 0.8152777777777778 | 0 |
| 0.8159722222222222 | 0 |
| 0.8166666666666668 | 0 |
| 0.8173611111111111 | 0 |
| 0.8180555555555555 | 0 |
| 0.81875 | 0 |
| 0.8194444444444445 | 0 |
| 0.8201388888888889 | 0 |
| 0.8208333333333333 | 0 |
| 0.8215277777777777 | 0 |
| 0.8222222222222223 | 0 |
| 0.8229166666666666 | 0 |
| 0.8236111111111111 | 0 |
| 0.8243055555555556 | 0 |
| 0.8250000000000001 | 0 |
| 0.8256944444444444 | 0 |
| 0.8263888888888888 | 0 |
| 0.8270833333333334 | 0 |
| 0.8277777777777778 | 0 |
| 0.8284722222222222 | 0 |
| 0.8291666666666666 | 0 |
| 0.8298611111111112 | 0 |
| 0.8305555555555556 | 0 |
| 0.8312499999999999 | 0 |
| 0.8319444444444444 | 0 |
| 0.8326388888888889 | 0 |
| 0.8333333333333334 | 0 |
| 0.8340277777777777 | 0 |
| 0.8347222222222223 | 0 |
| 0.8354166666666667 | 0 |
| 0.8361111111111111 | 0 |
| 0.8368055555555555 | 0 |
| 0.8375 | 0 |
| 0.8381944444444445 | 0 |
| 0.8388888888888889 | 0 |
| 0.8395833333333332 | 0 |
| 0.8402777777777778 | 0 |
| 0.8409722222222222 | 0 |
| 0.8416666666666667 | 0 |
| 0.842361111111111 | 0 |
| 0.8430555555555556 | 0 |
| 0.84375 | 0 |
| 0.8444444444444444 | 0 |
| 0.845138888888889 | 0 |
| 0.8458333333333333 | 0 |
| 0.8465277777777778 | 0 |
| 0.8472222222222222 | 0 |
| 0.8479166666666668 | 0 |
| 0.8486111111111111 | 0 |
| 0.8493055555555555 | 0 |
| 0.85 | 0 |
| 0.8506944444444445 | 0 |
| 0.8513888888888889 | 0 |
| 0.8520833333333333 | 0 |
| 0.8527777777777777 | 0 |
| 0.8534722222222223 | 0 |
| 0.8541666666666666 | 0 |
| 0.8548611111111111 | 0 |
| 0.8555555555555556 | 0 |
| 0.8562500000000001 | 0 |
| 0.8569444444444444 | 0 |
| 0.8576388888888888 | 0 |
| 0.8583333333333334 | 0 |
| 0.8590277777777778 | 0 |
| 0.8597222222222222 | 0 |
| 0.8604166666666666 | 0 |
| 0.8611111111111112 | 0 |
| 0.8618055555555556 | 0 |
| 0.8624999999999999 | 0 |
| 0.8631944444444444 | 0 |
| 0.8638888888888889 | 0 |
| 0.8645833333333334 | 0 |
| 0.8652777777777777 | 0 |
| 0.8659722222222223 | 0 |
| 0.8666666666666667 | 0 |
| 0.8673611111111111 | 0 |
| 0.8680555555555555 | 0 |
| 0.86875 | 0 |
| 0.8694444444444445 | 0 |
| 0.8701388888888889 | 0 |
| 0.8708333333333332 | 0 |
| 0.8715277777777778 | 0 |
| 0.8722222222222222 | 0 |
| 0.8729166666666667 | 0 |
| 0.873611111111111 | 0 |
| 0.8743055555555556 | 0 |
| 0.875 | 0 |
| 0.8756944444444444 | 0 |
| 0.876388888888889 | 0 |
| 0.8770833333333333 | 0 |
| 0.8777777777777778 | 0 |
| 0.8784722222222222 | 0 |
| 0.8791666666666668 | 0 |
| 0.8798611111111111 | 0 |
| 0.8805555555555555 | 0 |
| 0.88125 | 0 |
| 0.8819444444444445 | 0 |
| 0.8826388888888889 | 0 |
| 0.8833333333333333 | 0 |
| 0.8840277777777777 | 0 |
| 0.8847222222222223 | 0 |
| 0.8854166666666666 | 0 |
| 0.8861111111111111 | 0 |
| 0.8868055555555556 | 0 |
| 0.8875000000000001 | 0 |
| 0.8881944444444444 | 0 |
| 0.8888888888888888 | 0 |
| 0.8895833333333334 | 0 |
| 0.8902777777777778 | 0 |
| 0.8909722222222222 | 0 |
| 0.8916666666666666 | 0 |
| 0.8923611111111112 | 0 |
| 0.8930555555555556 | 0 |
| 0.8937499999999999 | 0 |
| 0.8944444444444444 | 0 |
| 0.8951388888888889 | 0 |
| 0.8958333333333334 | 0 |
| 0.8965277777777777 | 0 |
| 0.8972222222222223 | 0 |
| 0.8979166666666667 | 0 |
| 0.8986111111111111 | 0 |
| 0.8993055555555555 | 0 |
| 0.9 | 0 |
| 0.9006944444444445 | 0 |
| 0.9013888888888889 | 0 |
| 0.9020833333333332 | 0 |
| 0.9027777777777778 | 0 |
| 0.9034722222222222 | 0 |
| 0.9041666666666667 | 0 |
| 0.904861111111111 | 0 |
| 0.9055555555555556 | 0 |
| 0.90625 | 0 |
| 0.9069444444444444 | 0 |
| 0.907638888888889 | 0 |
| 0.9083333333333333 | 0 |
| 0.9090277777777778 | 0 |
| 0.9097222222222222 | 0 |
| 0.9104166666666668 | 0 |
| 0.9111111111111111 | 0 |
| 0.9118055555555555 | 0 |
| 0.9125 | 0 |
| 0.9131944444444445 | 0 |
| 0.9138888888888889 | 0 |
| 0.9145833333333333 | 0 |
| 0.9152777777777777 | 0 |
| 0.9159722222222223 | 0 |
| 0.9166666666666666 | 0 |
| 0.9173611111111111 | 0 |
| 0.9180555555555556 | 0 |
| 0.9187500000000001 | 0 |
| 0.9194444444444444 | 0 |
| 0.9201388888888888 | 0 |
| 0.9208333333333334 | 0 |
| 0.9215277777777778 | 0 |
| 0.9222222222222222 | 0 |
| 0.9229166666666666 | 0 |
| 0.9236111111111112 | 0 |
| 0.9243055555555556 | 0 |
| 0.9249999999999999 | 0 |
| 0.9256944444444444 | 0 |
| 0.9263888888888889 | 0 |
| 0.9270833333333334 | 0 |
| 0.9277777777777777 | 0 |
| 0.9284722222222223 | 0 |
| 0.9291666666666667 | 0 |
| 0.9298611111111111 | 0 |
| 0.9305555555555555 | 0 |
| 0.93125 | 0 |
| 0.9319444444444445 | 0 |
| 0.9326388888888889 | 0 |
| 0.9333333333333332 | 0 |
| 0.9340277777777778 | 0 |
| 0.9347222222222222 | 0 |
| 0.9354166666666667 | 0 |
| 0.936111111111111 | 0 |
| 0.9368055555555556 | 0 |
| 0.9375 | 0 |
| 0.9381944444444444 | 0 |
| 0.938888888888889 | 0 |
| 0.9395833333333333 | 0 |
| 0.9402777777777778 | 0 |
| 0.9409722222222222 | 0 |
| 0.9416666666666668 | 0 |
| 0.9423611111111111 | 0 |
| 0.9430555555555555 | 0 |
| 0.94375 | 0 |
| 0.9444444444444445 | 0 |
| 0.9451388888888889 | 0 |
| 0.9458333333333333 | 0 |
| 0.9465277777777777 | 0 |
| 0.9472222222222223 | 0 |
| 0.9479166666666666 | 0 |
| 0.9486111111111111 | 0 |
| 0.9493055555555556 | 0 |
| 0.9500000000000001 | 0 |
| 0.9506944444444444 | 0 |
| 0.9513888888888888 | 0 |
| 0.9520833333333334 | 0 |
| 0.9527777777777778 | 0 |
| 0.9534722222222222 | 0 |
| 0.9541666666666666 | 0 |
| 0.9548611111111112 | 0 |
| 0.9555555555555556 | 0 |
| 0.9562499999999999 | 0 |
| 0.9569444444444444 | 0 |
| 0.9576388888888889 | 0 |
| 0.9583333333333334 | 0 |
| 0.9590277777777777 | 0 |
| 0.9597222222222223 | 0 |
| 0.9604166666666667 | 0 |
| 0.9611111111111111 | 0 |
| 0.9618055555555555 | 0 |
| 0.9625 | 0 |
| 0.9631944444444445 | 0 |
| 0.9638888888888889 | 0 |
| 0.9645833333333332 | 0 |
| 0.9652777777777778 | 0 |
| 0.9659722222222222 | 0 |
| 0.9666666666666667 | 0 |
| 0.967361111111111 | 0 |
| 0.9680555555555556 | 0 |
| 0.96875 | 0 |
| 0.9694444444444444 | 0 |
| 0.970138888888889 | 0 |
| 0.9708333333333333 | 0 |
| 0.9715277777777778 | 0 |
| 0.9722222222222222 | 0 |
| 0.9729166666666668 | 0 |
| 0.9736111111111111 | 0 |
| 0.9743055555555555 | 0 |
| 0.975 | 0 |
| 0.9756944444444445 | 0 |
| 0.9763888888888889 | 0 |
| 0.9770833333333333 | 0 |
| 0.9777777777777777 | 0 |
| 0.9784722222222223 | 0 |
| 0.9791666666666666 | 0 |
| 0.9798611111111111 | 0 |
| 0.9805555555555556 | 0 |
| 0.9812500000000001 | 0 |
| 0.9819444444444444 | 0 |
| 0.9826388888888888 | 0 |
| 0.9833333333333334 | 0 |
| 0.9840277777777778 | 0 |
| 0.9847222222222222 | 0 |
| 0.9854166666666666 | 0 |
| 0.9861111111111112 | 0 |
| 0.9868055555555556 | 0 |
| 0.9874999999999999 | 0 |
| 0.9881944444444444 | 0 |
| 0.9888888888888889 | 0 |
| 0.9895833333333334 | 0 |
| 0.9902777777777777 | 0 |
| 0.9909722222222223 | 0 |
| 0.9916666666666667 | 0 |
| 0.9923611111111111 | 0 |
| 0.9930555555555555 | 0 |
| 0.99375 | 0 |
| 0.9944444444444445 | 0 |
| 0.9951388888888889 | 0 |
| 0.9958333333333332 | 0 |
| 0.9965277777777778 | 0 |
| 0.9972222222222222 | 0 |
| 0.9979166666666667 | 0 |
| 0.998611111111111 | 0 |
| 0.9993055555555556 | 0 |